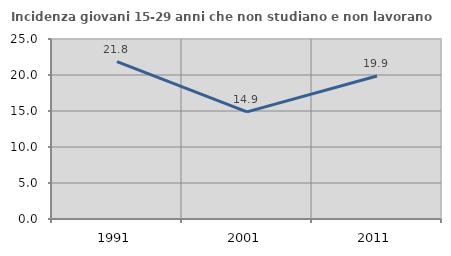
| Category | Incidenza giovani 15-29 anni che non studiano e non lavorano  |
|---|---|
| 1991.0 | 21.847 |
| 2001.0 | 14.884 |
| 2011.0 | 19.861 |